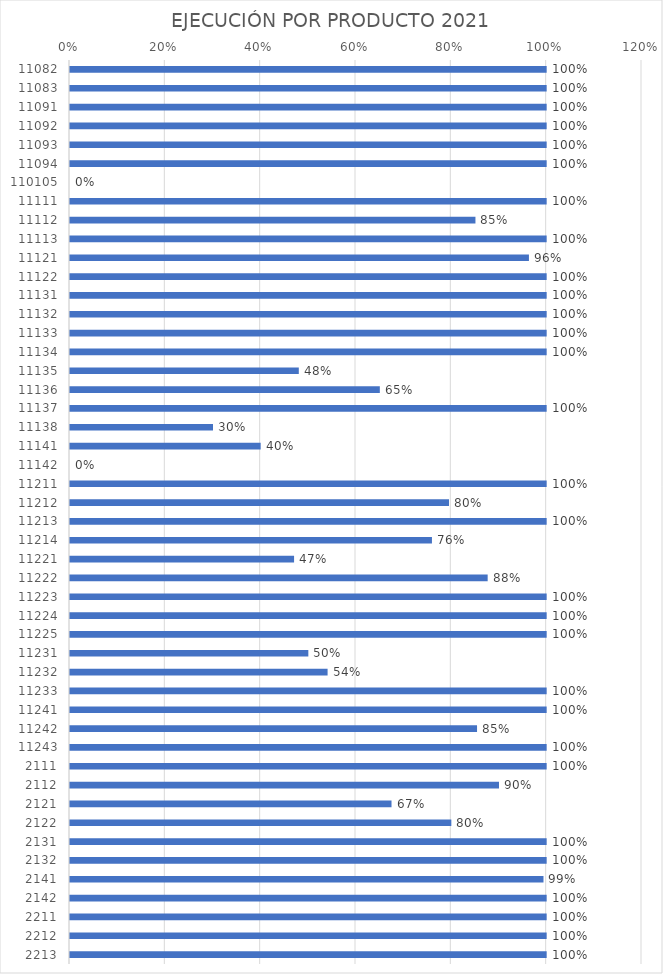
| Category | Series 0 |
|---|---|
| 11082.0 | 1 |
| 11083.0 | 1 |
| 11091.0 | 1 |
| 11092.0 | 1 |
| 11093.0 | 1 |
| 11094.0 | 1 |
| 110105.0 | 0 |
| 11111.0 | 1 |
| 11112.0 | 0.851 |
| 11113.0 | 1 |
| 11121.0 | 0.963 |
| 11122.0 | 1 |
| 11131.0 | 1 |
| 11132.0 | 1 |
| 11133.0 | 1 |
| 11134.0 | 1 |
| 11135.0 | 0.48 |
| 11136.0 | 0.65 |
| 11137.0 | 1 |
| 11138.0 | 0.3 |
| 11141.0 | 0.4 |
| 11142.0 | 0 |
| 11211.0 | 1 |
| 11212.0 | 0.795 |
| 11213.0 | 1 |
| 11214.0 | 0.759 |
| 11221.0 | 0.47 |
| 11222.0 | 0.876 |
| 11223.0 | 1 |
| 11224.0 | 1 |
| 11225.0 | 1 |
| 11231.0 | 0.5 |
| 11232.0 | 0.54 |
| 11233.0 | 1 |
| 11241.0 | 1 |
| 11242.0 | 0.854 |
| 11243.0 | 1 |
| 2111.0 | 1 |
| 2112.0 | 0.9 |
| 2121.0 | 0.675 |
| 2122.0 | 0.8 |
| 2131.0 | 1 |
| 2132.0 | 1 |
| 2141.0 | 0.993 |
| 2142.0 | 1 |
| 2211.0 | 1 |
| 2212.0 | 1 |
| 2213.0 | 1 |